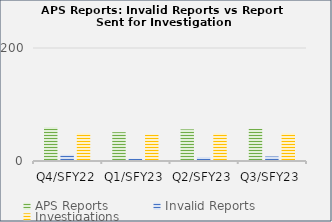
| Category | APS Reports | Invalid Reports | Investigations |
|---|---|---|---|
| Q4/SFY22 | 60 | 11 | 49 |
| Q1/SFY23 | 51 | 4 | 47 |
| Q2/SFY23 | 56 | 7 | 49 |
| Q3/SFY23 | 57 | 8 | 49 |